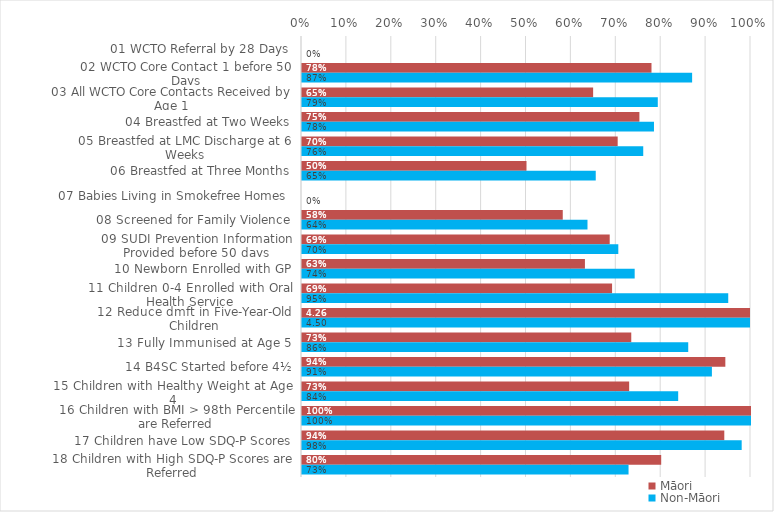
| Category | Māori | Non-Māori |
|---|---|---|
| 01 WCTO Referral by 28 Days | 0 | 0 |
| 02 WCTO Core Contact 1 before 50 Days | 0.778 | 0.869 |
| 03 All WCTO Core Contacts Received by Age 1 | 0.648 | 0.792 |
| 04 Breastfed at Two Weeks | 0.751 | 0.784 |
| 05 Breastfed at LMC Discharge at 6 Weeks | 0.703 | 0.76 |
| 06 Breastfed at Three Months | 0.5 | 0.654 |
| 07 Babies Living in Smokefree Homes  | 0 | 0 |
| 08 Screened for Family Violence | 0.581 | 0.636 |
| 09 SUDI Prevention Information Provided before 50 days | 0.685 | 0.704 |
| 10 Newborn Enrolled with GP | 0.63 | 0.741 |
| 11 Children 0-4 Enrolled with Oral Health Service | 0.691 | 0.949 |
| 12 Reduce dmft in Five-Year-Old Children | 4.261 | 4.5 |
| 13 Fully Immunised at Age 5 | 0.733 | 0.86 |
| 14 B4SC Started before 4½ | 0.943 | 0.913 |
| 15 Children with Healthy Weight at Age 4 | 0.729 | 0.838 |
| 16 Children with BMI > 98th Percentile are Referred | 1 | 1 |
| 17 Children have Low SDQ-P Scores | 0.941 | 0.979 |
| 18 Children with High SDQ-P Scores are Referred | 0.8 | 0.727 |